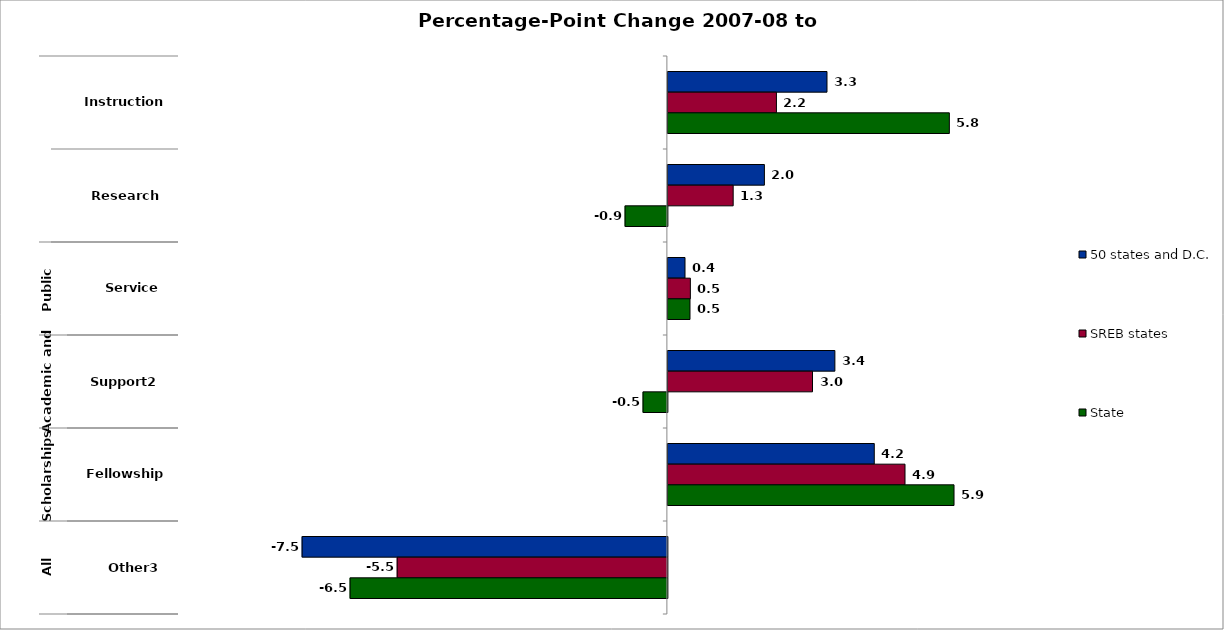
| Category | 50 states and D.C. | SREB states | State |
|---|---|---|---|
| 0 | 3.254 | 2.22 | 5.757 |
| 1 | 1.974 | 1.336 | -0.865 |
| 2 | 0.35 | 0.46 | 0.452 |
| 3 | 3.416 | 2.958 | -0.498 |
| 4 | 4.222 | 4.85 | 5.853 |
| 5 | -7.472 | -5.527 | -6.49 |